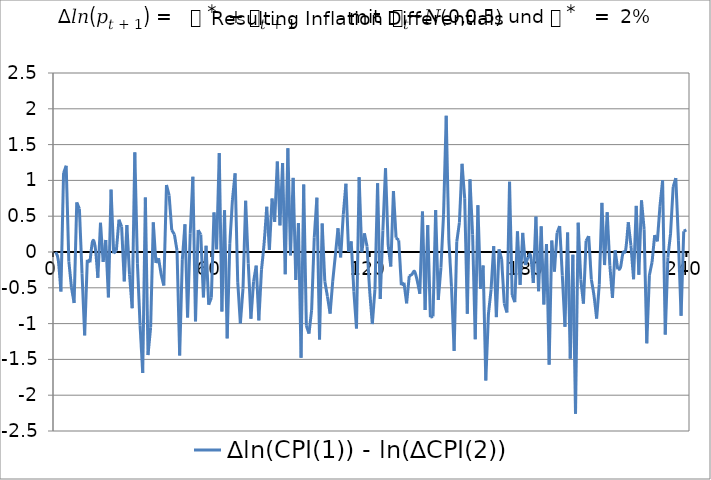
| Category | ∆ln(CPI(1)) - ln(∆CPI(2)) |
|---|---|
| 1.0 | 0 |
| 2.0 | -0.112 |
| 3.0 | -0.552 |
| 4.0 | 1.102 |
| 5.0 | 1.205 |
| 6.0 | -0.131 |
| 7.0 | -0.496 |
| 8.0 | -0.712 |
| 9.0 | 0.693 |
| 10.0 | 0.604 |
| 11.0 | -0.297 |
| 12.0 | -1.165 |
| 13.0 | -0.11 |
| 14.0 | -0.144 |
| 15.0 | 0.15 |
| 16.0 | 0.067 |
| 17.0 | -0.36 |
| 18.0 | 0.409 |
| 19.0 | -0.139 |
| 20.0 | 0.168 |
| 21.0 | -0.634 |
| 22.0 | 0.871 |
| 23.0 | -0.019 |
| 24.0 | 0.018 |
| 25.0 | 0.451 |
| 26.0 | 0.354 |
| 27.0 | -0.409 |
| 28.0 | 0.377 |
| 29.0 | -0.317 |
| 30.0 | -0.785 |
| 31.0 | 1.392 |
| 32.0 | -0.163 |
| 33.0 | -1.028 |
| 34.0 | -1.689 |
| 35.0 | 0.761 |
| 36.0 | -1.44 |
| 37.0 | -1.052 |
| 38.0 | 0.414 |
| 39.0 | -0.153 |
| 40.0 | -0.086 |
| 41.0 | -0.313 |
| 42.0 | -0.469 |
| 43.0 | 0.936 |
| 44.0 | 0.791 |
| 45.0 | 0.307 |
| 46.0 | 0.246 |
| 47.0 | 0.018 |
| 48.0 | -1.446 |
| 49.0 | -0.11 |
| 50.0 | 0.387 |
| 51.0 | -0.914 |
| 52.0 | 0.255 |
| 53.0 | 1.052 |
| 54.0 | -0.969 |
| 55.0 | 0.306 |
| 56.0 | 0.244 |
| 57.0 | -0.634 |
| 58.0 | 0.087 |
| 59.0 | -0.736 |
| 60.0 | -0.639 |
| 61.0 | 0.553 |
| 62.0 | 0.038 |
| 63.0 | 1.381 |
| 64.0 | -0.831 |
| 65.0 | 0.583 |
| 66.0 | -1.207 |
| 67.0 | 0.113 |
| 68.0 | 0.727 |
| 69.0 | 1.099 |
| 70.0 | -0.421 |
| 71.0 | -0.998 |
| 72.0 | -0.508 |
| 73.0 | 0.716 |
| 74.0 | -0.159 |
| 75.0 | -0.932 |
| 76.0 | -0.415 |
| 77.0 | -0.189 |
| 78.0 | -0.954 |
| 79.0 | -0.249 |
| 80.0 | 0.125 |
| 81.0 | 0.632 |
| 82.0 | 0.029 |
| 83.0 | 0.747 |
| 84.0 | 0.421 |
| 85.0 | 1.264 |
| 86.0 | 0.371 |
| 87.0 | 1.244 |
| 88.0 | -0.311 |
| 89.0 | 1.448 |
| 90.0 | -0.047 |
| 91.0 | 1.035 |
| 92.0 | -0.391 |
| 93.0 | 0.403 |
| 94.0 | -1.477 |
| 95.0 | 0.942 |
| 96.0 | -1.03 |
| 97.0 | -1.14 |
| 98.0 | -0.812 |
| 99.0 | 0.206 |
| 100.0 | 0.758 |
| 101.0 | -1.223 |
| 102.0 | 0.398 |
| 103.0 | -0.41 |
| 104.0 | -0.622 |
| 105.0 | -0.86 |
| 106.0 | -0.406 |
| 107.0 | -0.043 |
| 108.0 | 0.332 |
| 109.0 | -0.076 |
| 110.0 | 0.524 |
| 111.0 | 0.954 |
| 112.0 | 0.004 |
| 113.0 | 0.148 |
| 114.0 | -0.551 |
| 115.0 | -1.068 |
| 116.0 | 1.045 |
| 117.0 | -0.004 |
| 118.0 | 0.261 |
| 119.0 | 0.076 |
| 120.0 | -0.545 |
| 121.0 | -1.006 |
| 122.0 | -0.52 |
| 123.0 | 0.961 |
| 124.0 | -0.657 |
| 125.0 | 0.3 |
| 126.0 | 1.17 |
| 127.0 | 0.099 |
| 128.0 | -0.203 |
| 129.0 | 0.851 |
| 130.0 | 0.199 |
| 131.0 | 0.164 |
| 132.0 | -0.463 |
| 133.0 | -0.429 |
| 134.0 | -0.717 |
| 135.0 | -0.334 |
| 136.0 | -0.313 |
| 137.0 | -0.271 |
| 138.0 | -0.398 |
| 139.0 | -0.584 |
| 140.0 | 0.565 |
| 141.0 | -0.81 |
| 142.0 | 0.375 |
| 143.0 | -0.911 |
| 144.0 | -0.901 |
| 145.0 | 0.585 |
| 146.0 | -0.67 |
| 147.0 | -0.218 |
| 148.0 | 0.529 |
| 149.0 | 1.902 |
| 150.0 | 0.168 |
| 151.0 | -0.486 |
| 152.0 | -1.381 |
| 153.0 | 0.143 |
| 154.0 | 0.41 |
| 155.0 | 1.232 |
| 156.0 | 0.75 |
| 157.0 | -0.863 |
| 158.0 | 1.014 |
| 159.0 | 0.242 |
| 160.0 | -1.219 |
| 161.0 | 0.653 |
| 162.0 | -0.513 |
| 163.0 | -0.188 |
| 164.0 | -1.795 |
| 165.0 | -0.867 |
| 166.0 | -0.526 |
| 167.0 | 0.081 |
| 168.0 | -0.909 |
| 169.0 | 0.037 |
| 170.0 | -0.099 |
| 171.0 | -0.719 |
| 172.0 | -0.845 |
| 173.0 | 0.982 |
| 174.0 | -0.6 |
| 175.0 | -0.701 |
| 176.0 | 0.289 |
| 177.0 | -0.46 |
| 178.0 | 0.267 |
| 179.0 | -0.182 |
| 180.0 | -0.073 |
| 181.0 | -0.054 |
| 182.0 | -0.433 |
| 183.0 | 0.494 |
| 184.0 | -0.547 |
| 185.0 | 0.358 |
| 186.0 | -0.734 |
| 187.0 | 0.111 |
| 188.0 | -1.573 |
| 189.0 | 0.16 |
| 190.0 | -0.275 |
| 191.0 | 0.268 |
| 192.0 | 0.362 |
| 193.0 | -0.33 |
| 194.0 | -1.044 |
| 195.0 | 0.272 |
| 196.0 | -1.489 |
| 197.0 | -0.039 |
| 198.0 | -2.258 |
| 199.0 | 0.409 |
| 200.0 | -0.386 |
| 201.0 | -0.721 |
| 202.0 | 0.155 |
| 203.0 | 0.222 |
| 204.0 | -0.386 |
| 205.0 | -0.61 |
| 206.0 | -0.929 |
| 207.0 | -0.456 |
| 208.0 | 0.687 |
| 209.0 | -0.182 |
| 210.0 | 0.556 |
| 211.0 | -0.185 |
| 212.0 | -0.641 |
| 213.0 | 0.025 |
| 214.0 | -0.242 |
| 215.0 | -0.22 |
| 216.0 | -0.01 |
| 217.0 | 0.028 |
| 218.0 | 0.416 |
| 219.0 | 0.089 |
| 220.0 | -0.38 |
| 221.0 | 0.643 |
| 222.0 | -0.318 |
| 223.0 | 0.722 |
| 224.0 | 0.317 |
| 225.0 | -1.275 |
| 226.0 | -0.323 |
| 227.0 | -0.142 |
| 228.0 | 0.236 |
| 229.0 | 0.148 |
| 230.0 | 0.642 |
| 231.0 | 1.001 |
| 232.0 | -1.154 |
| 233.0 | -0.075 |
| 234.0 | 0.254 |
| 235.0 | 0.908 |
| 236.0 | 1.032 |
| 237.0 | 0.155 |
| 238.0 | -0.89 |
| 239.0 | 0.291 |
| 240.0 | 0.309 |